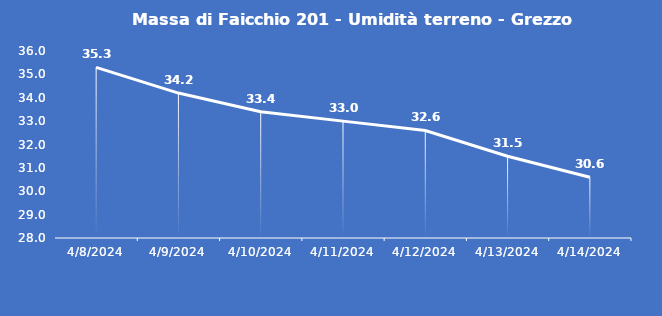
| Category | Massa di Faicchio 201 - Umidità terreno - Grezzo (%VWC) |
|---|---|
| 4/8/24 | 35.3 |
| 4/9/24 | 34.2 |
| 4/10/24 | 33.4 |
| 4/11/24 | 33 |
| 4/12/24 | 32.6 |
| 4/13/24 | 31.5 |
| 4/14/24 | 30.6 |